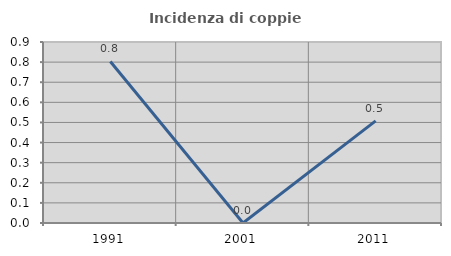
| Category | Incidenza di coppie miste |
|---|---|
| 1991.0 | 0.803 |
| 2001.0 | 0 |
| 2011.0 | 0.508 |